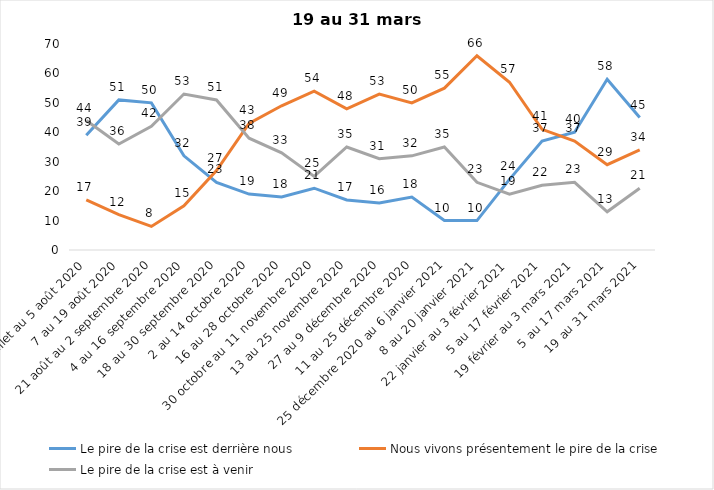
| Category | Le pire de la crise est derrière nous | Nous vivons présentement le pire de la crise | Le pire de la crise est à venir |
|---|---|---|---|
| 24 juillet au 5 août 2020 | 39 | 17 | 44 |
| 7 au 19 août 2020 | 51 | 12 | 36 |
| 21 août au 2 septembre 2020 | 50 | 8 | 42 |
| 4 au 16 septembre 2020 | 32 | 15 | 53 |
| 18 au 30 septembre 2020 | 23 | 27 | 51 |
| 2 au 14 octobre 2020 | 19 | 43 | 38 |
| 16 au 28 octobre 2020 | 18 | 49 | 33 |
| 30 octobre au 11 novembre 2020 | 21 | 54 | 25 |
| 13 au 25 novembre 2020 | 17 | 48 | 35 |
| 27 au 9 décembre 2020 | 16 | 53 | 31 |
| 11 au 25 décembre 2020 | 18 | 50 | 32 |
| 25 décembre 2020 au 6 janvier 2021 | 10 | 55 | 35 |
| 8 au 20 janvier 2021 | 10 | 66 | 23 |
| 22 janvier au 3 février 2021 | 24 | 57 | 19 |
| 5 au 17 février 2021 | 37 | 41 | 22 |
| 19 février au 3 mars 2021 | 40 | 37 | 23 |
| 5 au 17 mars 2021 | 58 | 29 | 13 |
| 19 au 31 mars 2021 | 45 | 34 | 21 |